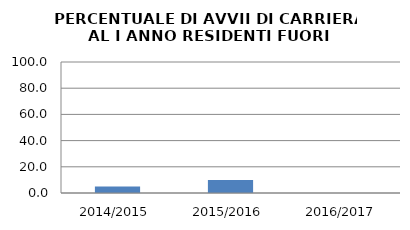
| Category | 2014/2015 2015/2016 2016/2017 |
|---|---|
| 2014/2015 | 5 |
| 2015/2016 | 10 |
| 2016/2017 | 0 |